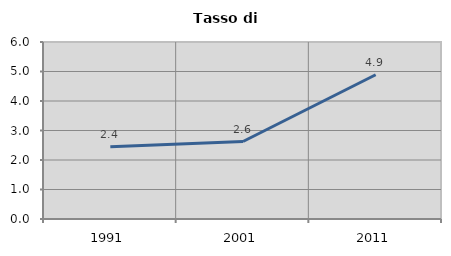
| Category | Tasso di disoccupazione   |
|---|---|
| 1991.0 | 2.447 |
| 2001.0 | 2.627 |
| 2011.0 | 4.891 |